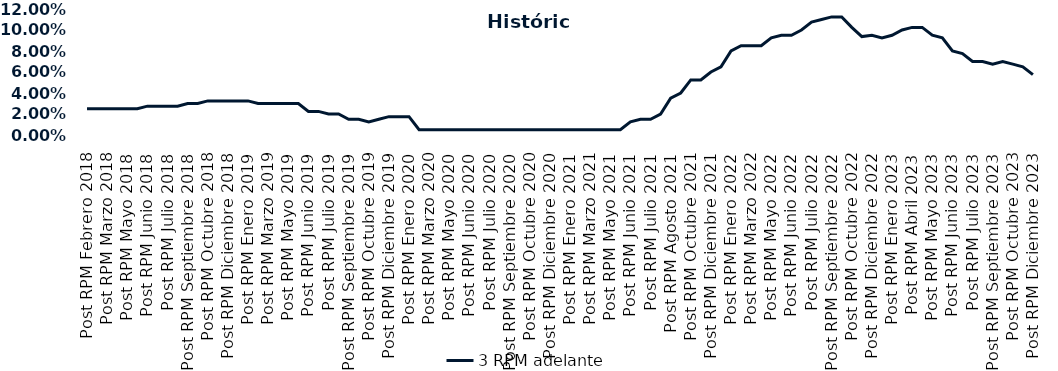
| Category | 3 RPM adelante |
|---|---|
| Post RPM Febrero 2018 | 0.025 |
| Pre RPM Marzo 2018 | 0.025 |
| Post RPM Marzo 2018 | 0.025 |
| Pre RPM Mayo 2018 | 0.025 |
| Post RPM Mayo 2018 | 0.025 |
| Pre RPM Junio 2018 | 0.025 |
| Post RPM Junio 2018 | 0.028 |
| Pre RPM Julio 2018 | 0.028 |
| Post RPM Julio 2018 | 0.028 |
| Pre RPM Septiembre 2018 | 0.028 |
| Post RPM Septiembre 2018 | 0.03 |
| Pre RPM Octubre 2018 | 0.03 |
| Post RPM Octubre 2018 | 0.032 |
| Pre RPM Diciembre 2018 | 0.032 |
| Post RPM Diciembre 2018 | 0.032 |
| Pre RPM Enero 2019 | 0.032 |
| Post RPM Enero 2019 | 0.032 |
| Pre RPM Marzo 2019 | 0.03 |
| Post RPM Marzo 2019 | 0.03 |
| Pre RPM Mayo 2019 | 0.03 |
| Post RPM Mayo 2019 | 0.03 |
| Pre RPM Junio 2019 | 0.03 |
| Post RPM Junio 2019 | 0.022 |
| Pre RPM Julio 2019 | 0.022 |
| Post RPM Julio 2019 | 0.02 |
| Pre RPM Septiembre 2019 | 0.02 |
| Post RPM Septiembre 2019 | 0.015 |
| Pre RPM Octubre 2019 | 0.015 |
| Post RPM Octubre 2019 | 0.012 |
| Pre RPM Diciembre 2019 | 0.015 |
| Post RPM Diciembre 2019 | 0.018 |
| Pre RPM Enero 2020 | 0.018 |
| Post RPM Enero 2020 | 0.018 |
| Pre RPM Marzo 2020 | 0.005 |
| Post RPM Marzo 2020 | 0.005 |
| Pre RPM Mayo 2020 | 0.005 |
| Post RPM Mayo 2020 | 0.005 |
| Pre RPM Junio 2020 | 0.005 |
| Post RPM Junio 2020 | 0.005 |
| Pre RPM Julio 2020 | 0.005 |
| Post RPM Julio 2020 | 0.005 |
| Pre RPM Septiembre 2020 | 0.005 |
| Post RPM Septiembre 2020 | 0.005 |
| Pre RPM Octubre 2020 | 0.005 |
| Post RPM Octubre 2020 | 0.005 |
| Pre RPM Diciembre 2020 | 0.005 |
| Post RPM Diciembre 2020 | 0.005 |
| Pre RPM Enero 2021 | 0.005 |
| Post RPM Enero 2021 | 0.005 |
| Pre RPM Marzo 2021 | 0.005 |
| Post RPM Marzo 2021 | 0.005 |
| Pre RPM Mayo 2021 | 0.005 |
| Post RPM Mayo 2021 | 0.005 |
| Pre RPM Junio 2021 | 0.005 |
| Post RPM Junio 2021 | 0.012 |
| Pre RPM Julio 2021 | 0.015 |
| Post RPM Julio 2021 | 0.015 |
| Pre RPM Agosto 2021 | 0.02 |
| Post RPM Agosto 2021 | 0.035 |
| Pre RPM Octubre 2021 | 0.04 |
| Post RPM Octubre 2021 | 0.052 |
| Pre RPM Diciembre 2021 | 0.052 |
| Post RPM Diciembre 2021 | 0.06 |
| Pre RPM Enero 2022 | 0.065 |
| Post RPM Enero 2022 | 0.08 |
| Pre RPM Marzo 2022 | 0.085 |
| Post RPM Marzo 2022 | 0.085 |
| Pre RPM Mayo 2022 | 0.085 |
| Post RPM Mayo 2022 | 0.092 |
| Pre RPM Junio 2022 | 0.095 |
| Post RPM Junio 2022 | 0.095 |
| Pre RPM Julio 2022 | 0.1 |
| Post RPM Julio 2022 | 0.108 |
| Pre RPM Septiembre 2022 | 0.11 |
| Post RPM Septiembre 2022 | 0.112 |
| Pre RPM Octubre 2022 | 0.112 |
| Post RPM Octubre 2022 | 0.102 |
| Pre RPM Diciembre 2022 | 0.094 |
| Post RPM Diciembre 2022 | 0.095 |
| Pre RPM Enero 2023 | 0.092 |
| Post RPM Enero 2023 | 0.095 |
| Pre RPM Abril 2023 | 0.1 |
| Post RPM Abril 2023 | 0.102 |
| Pre RPM Mayo 2023 | 0.102 |
| Post RPM Mayo 2023 | 0.095 |
| Pre RPM Junio 2023 | 0.092 |
| Post RPM Junio 2023 | 0.08 |
| Pre RPM Julio 2023 | 0.078 |
| Post RPM Julio 2023 | 0.07 |
| Pre RPM Septiembre 2023 | 0.07 |
| Post RPM Septiembre 2023 | 0.068 |
| Pre RPM Octubre 2023 | 0.07 |
| Post RPM Octubre 2023 | 0.068 |
| Pre RPM Diciembre 2023 | 0.065 |
| Post RPM Diciembre 2023 | 0.058 |